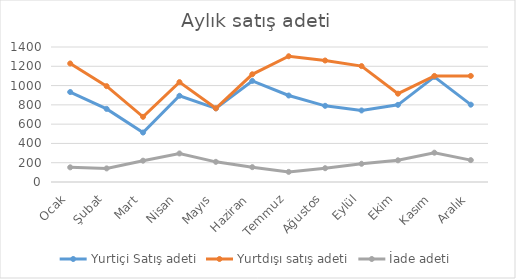
| Category | Yurtiçi Satış adeti | Yurtdışı satış adeti | İade adeti |
|---|---|---|---|
| Ocak | 933 | 1229 | 152 |
| Şubat | 758 | 994 | 141 |
| Mart | 513 | 676 | 221 |
| Nisan | 894 | 1036 | 296 |
| Mayıs | 764 | 764 | 209 |
| Haziran | 1048 | 1117 | 154 |
| Temmuz | 897 | 1304 | 105 |
| Ağustos | 790 | 1260 | 143 |
| Eylül | 742 | 1202 | 189 |
| Ekim | 800 | 916 | 225 |
| Kasım | 1090 | 1100 | 304 |
| Aralık | 802 | 1100 | 227 |